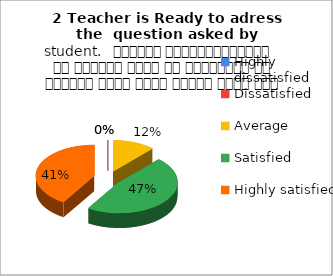
| Category | 2 Teacher is Ready to adress the  question asked by student.   शिक्षक विद्यार्थियों के द्वारा पूछे गए प्रश्नों का समाधान करने हेतु तत्पर रहते हैं |
|---|---|
| Highly dissatisfied | 0 |
| Dissatisfied | 0 |
| Average | 2 |
| Satisfied | 8 |
| Highly satisfied | 7 |